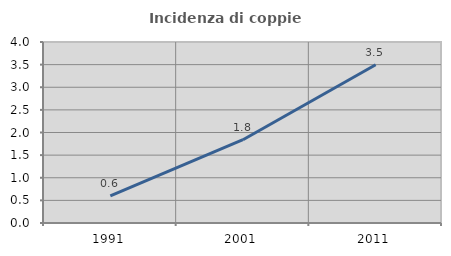
| Category | Incidenza di coppie miste |
|---|---|
| 1991.0 | 0.6 |
| 2001.0 | 1.84 |
| 2011.0 | 3.497 |